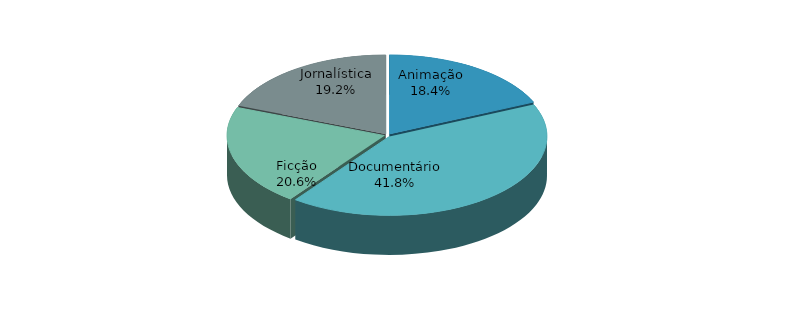
| Category | Series 0 | Series 1 |
|---|---|---|
| Animação | 11152 | 0.184 |
| Documentário | 25342 | 0.418 |
| Ficção | 12510 | 0.206 |
| Jornalística | 11645 | 0.192 |